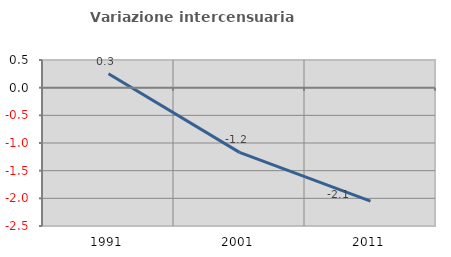
| Category | Variazione intercensuaria annua |
|---|---|
| 1991.0 | 0.252 |
| 2001.0 | -1.169 |
| 2011.0 | -2.051 |